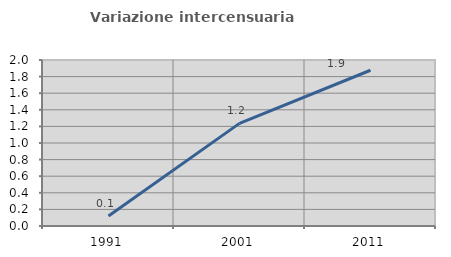
| Category | Variazione intercensuaria annua |
|---|---|
| 1991.0 | 0.121 |
| 2001.0 | 1.237 |
| 2011.0 | 1.877 |